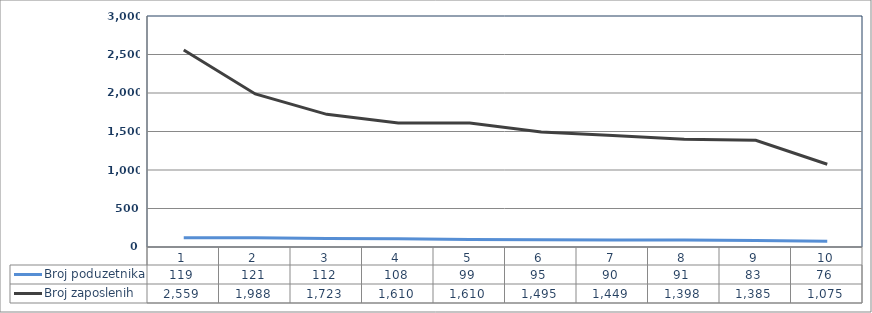
| Category | Broj poduzetnika | Broj zaposlenih |
|---|---|---|
| 0 | 119 | 2559 |
| 1 | 121 | 1988 |
| 2 | 112 | 1723 |
| 3 | 108 | 1610 |
| 4 | 99 | 1610 |
| 5 | 95 | 1495 |
| 6 | 90 | 1449 |
| 7 | 91 | 1398 |
| 8 | 83 | 1385 |
| 9 | 76 | 1075 |